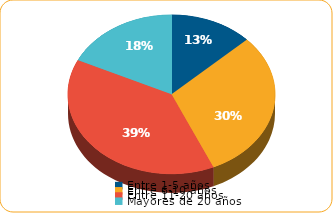
| Category | Series 0 |
|---|---|
| Entre 1-5 años | 1640 |
| Entre 6-10 años | 3858.9 |
| Entre 11-20 años | 4909.1 |
| Mayores de 20 años | 2269.7 |